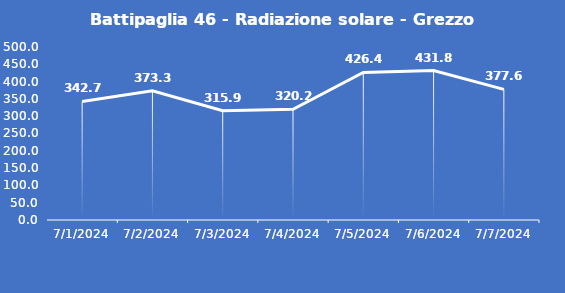
| Category | Battipaglia 46 - Radiazione solare - Grezzo (W/m2) |
|---|---|
| 7/1/24 | 342.7 |
| 7/2/24 | 373.3 |
| 7/3/24 | 315.9 |
| 7/4/24 | 320.2 |
| 7/5/24 | 426.4 |
| 7/6/24 | 431.8 |
| 7/7/24 | 377.6 |